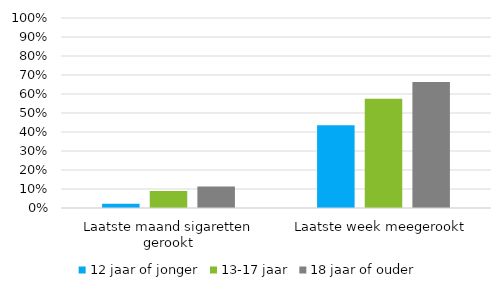
| Category | 12 jaar of jonger | 13-17 jaar | 18 jaar of ouder |
|---|---|---|---|
| Laatste maand sigaretten gerookt | 0.023 | 0.09 | 0.113 |
| Laatste week meegerookt | 0.436 | 0.575 | 0.663 |